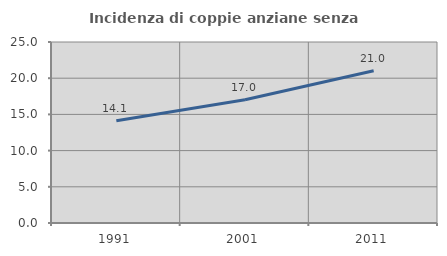
| Category | Incidenza di coppie anziane senza figli  |
|---|---|
| 1991.0 | 14.126 |
| 2001.0 | 17.021 |
| 2011.0 | 21.04 |